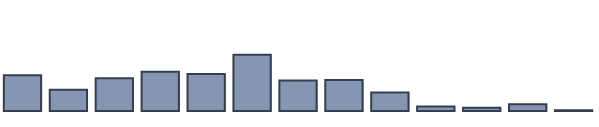
| Category | Series 0 |
|---|---|
| 0 | 11.3 |
| 1 | 6.7 |
| 2 | 10.3 |
| 3 | 12.4 |
| 4 | 11.7 |
| 5 | 17.7 |
| 6 | 9.6 |
| 7 | 9.8 |
| 8 | 5.8 |
| 9 | 1.4 |
| 10 | 1 |
| 11 | 2.1 |
| 12 | 0.2 |